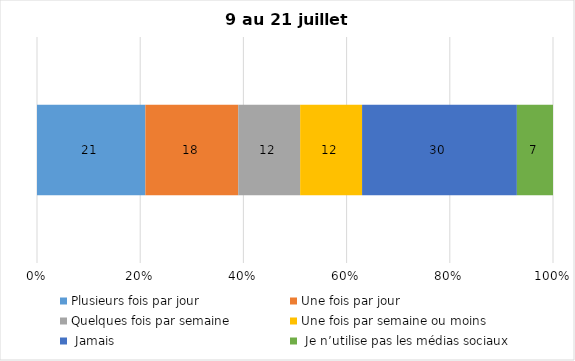
| Category | Plusieurs fois par jour | Une fois par jour | Quelques fois par semaine   | Une fois par semaine ou moins   |  Jamais   |  Je n’utilise pas les médias sociaux |
|---|---|---|---|---|---|---|
| 0 | 21 | 18 | 12 | 12 | 30 | 7 |